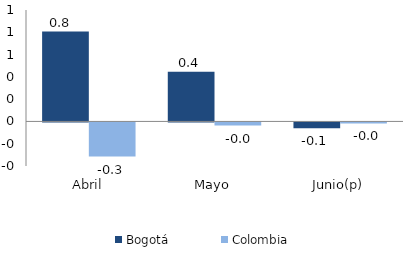
| Category | Bogotá | Colombia |
|---|---|---|
| Abril | 0.807 | -0.307 |
| Mayo | 0.446 | -0.028 |
| Junio(p) | -0.053 | -0.009 |